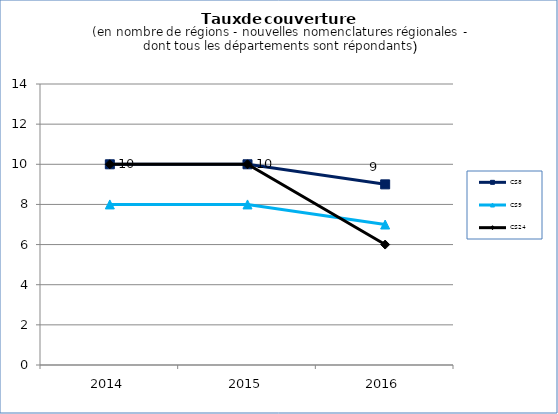
| Category | CS8 | CS9 | CS24 |
|---|---|---|---|
| 2014.0 | 10 | 8 | 10 |
| 2015.0 | 10 | 8 | 10 |
| 2016.0 | 9 | 7 | 6 |